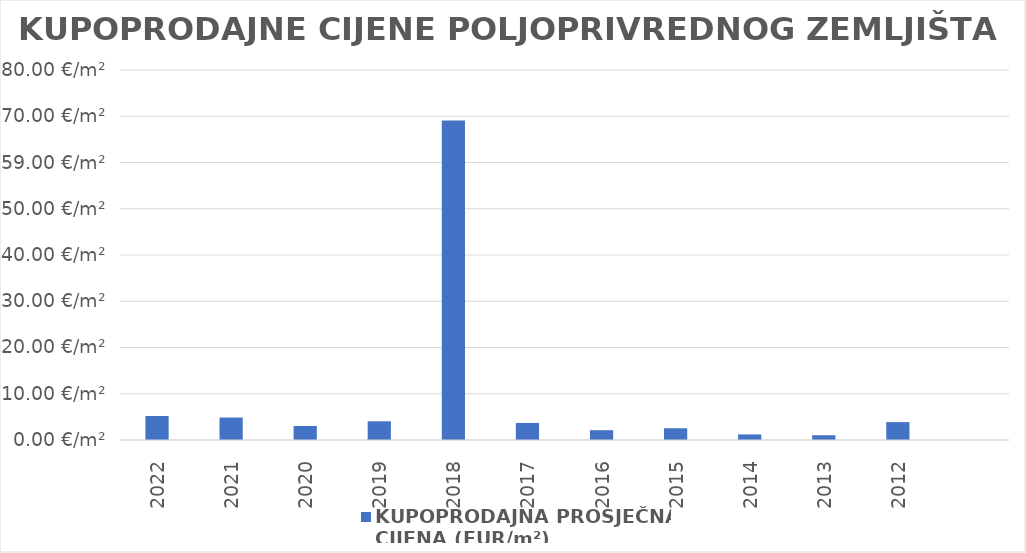
| Category | KUPOPRODAJNA PROSJEČNA 
CIJENA (EUR/m²) |
|---|---|
| 2022 | 1900-01-05 04:28:32 |
| 2021 | 1900-01-04 20:45:38 |
| 2020 | 1900-01-03 00:54:26 |
| 2019 | 1900-01-04 01:04:48 |
| 2018 | 1900-03-09 01:33:29 |
| 2017 | 1900-01-03 16:26:59 |
| 2016 | 1900-01-02 02:55:43 |
| 2015 | 1900-01-02 12:50:04 |
| 2014 | 1900-01-01 04:55:44 |
| 2013 | 1900-01-01 00:46:38 |
| 2012 | 1900-01-03 20:55:45 |